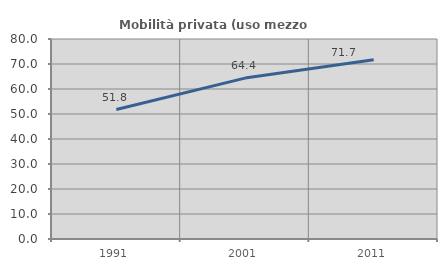
| Category | Mobilità privata (uso mezzo privato) |
|---|---|
| 1991.0 | 51.778 |
| 2001.0 | 64.361 |
| 2011.0 | 71.677 |